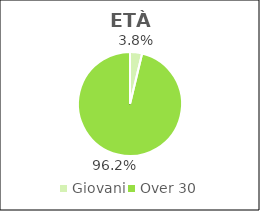
| Category | Series 0 |
|---|---|
| Giovani | 2650 |
| Over 30 | 67909 |